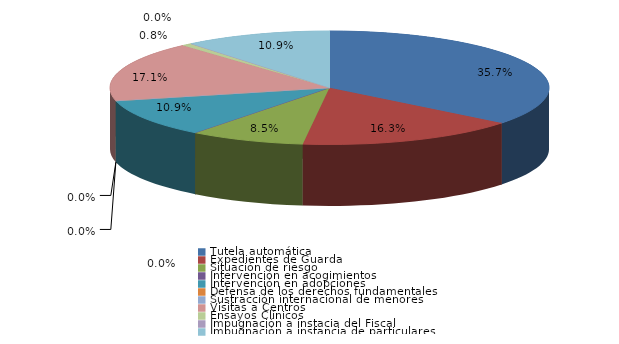
| Category | Series 0 |
|---|---|
| Tutela automática | 46 |
| Expedientes de Guarda | 21 |
| Situación de riesgo | 11 |
| Intervención en acogimientos | 0 |
| Intervención en adopciones | 14 |
| Defensa de los derechos fundamentales | 0 |
| Sustracción internacional de menores | 0 |
| Visitas a Centros | 22 |
| Ensayos Clínicos | 1 |
| Impugnación a instacia del Fiscal | 0 |
| Impugnación a instancia de particulares | 14 |